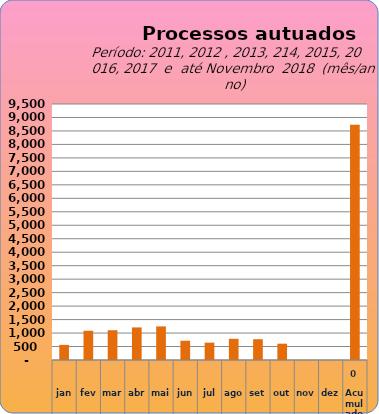
| Category | 6735 |
|---|---|
| jan | 560 |
| fev | 1085 |
| mar | 1105 |
| abr | 1209 |
| mai | 1247 |
| jun | 714 |
| jul | 644 |
| ago | 787 |
| set | 771 |
| out | 605 |
| nov | 0 |
| dez | 0 |
| Acumulado
 | 8727 |